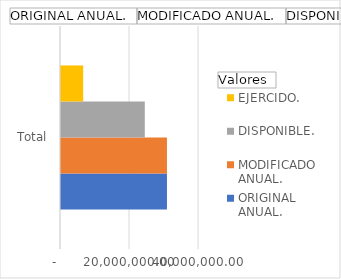
| Category | ORIGINAL ANUAL. | MODIFICADO ANUAL. | DISPONIBLE. | EJERCIDO. |
|---|---|---|---|---|
| Total | 30714625 | 30714625 | 24288108.14 | 6426516.86 |